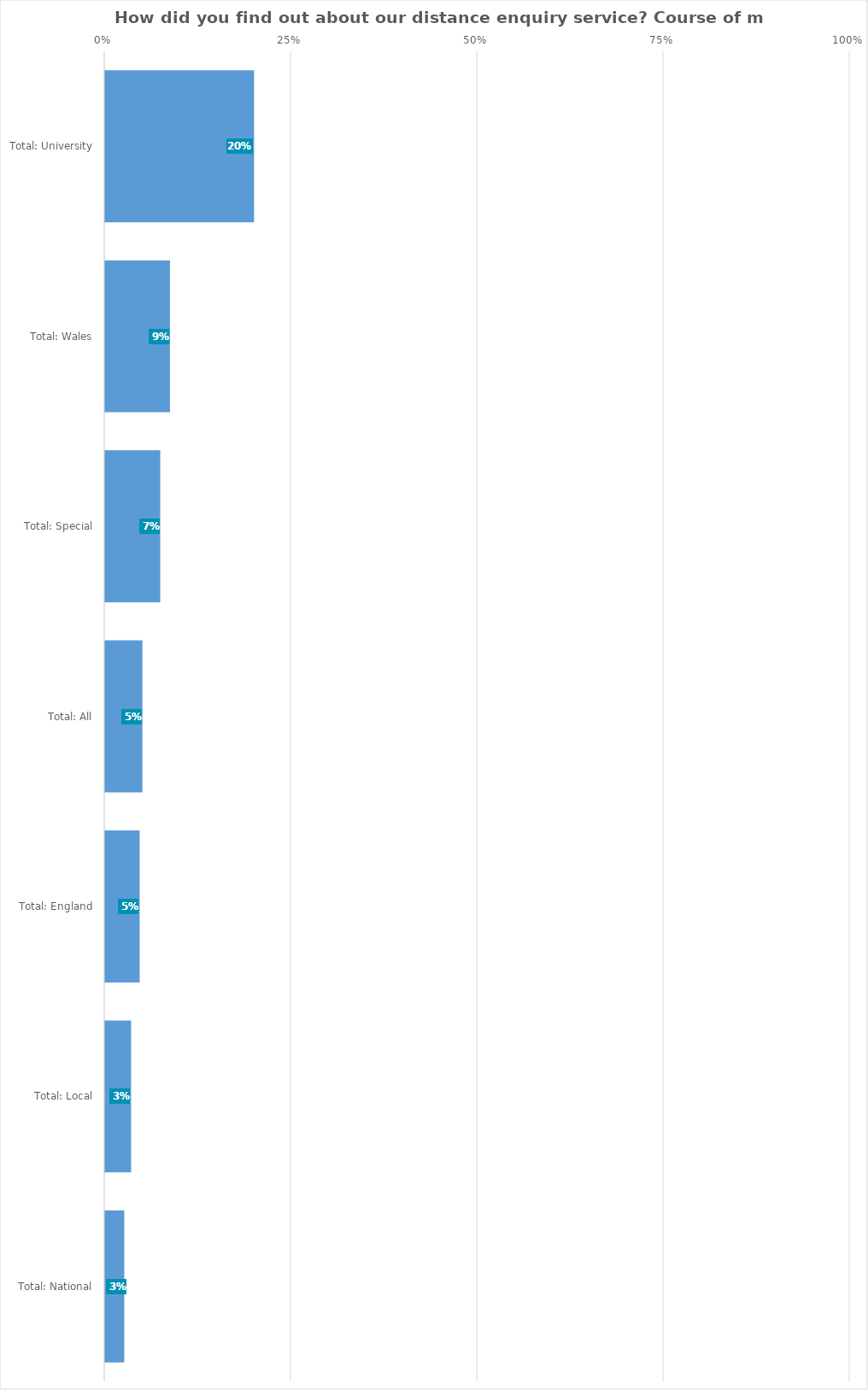
| Category | Course of my education |
|---|---|
| Total: University | 0.2 |
| Total: Wales | 0.087 |
| Total: Special | 0.074 |
| Total: All | 0.05 |
| Total: England | 0.046 |
| Total: Local | 0.035 |
| Total: National | 0.026 |